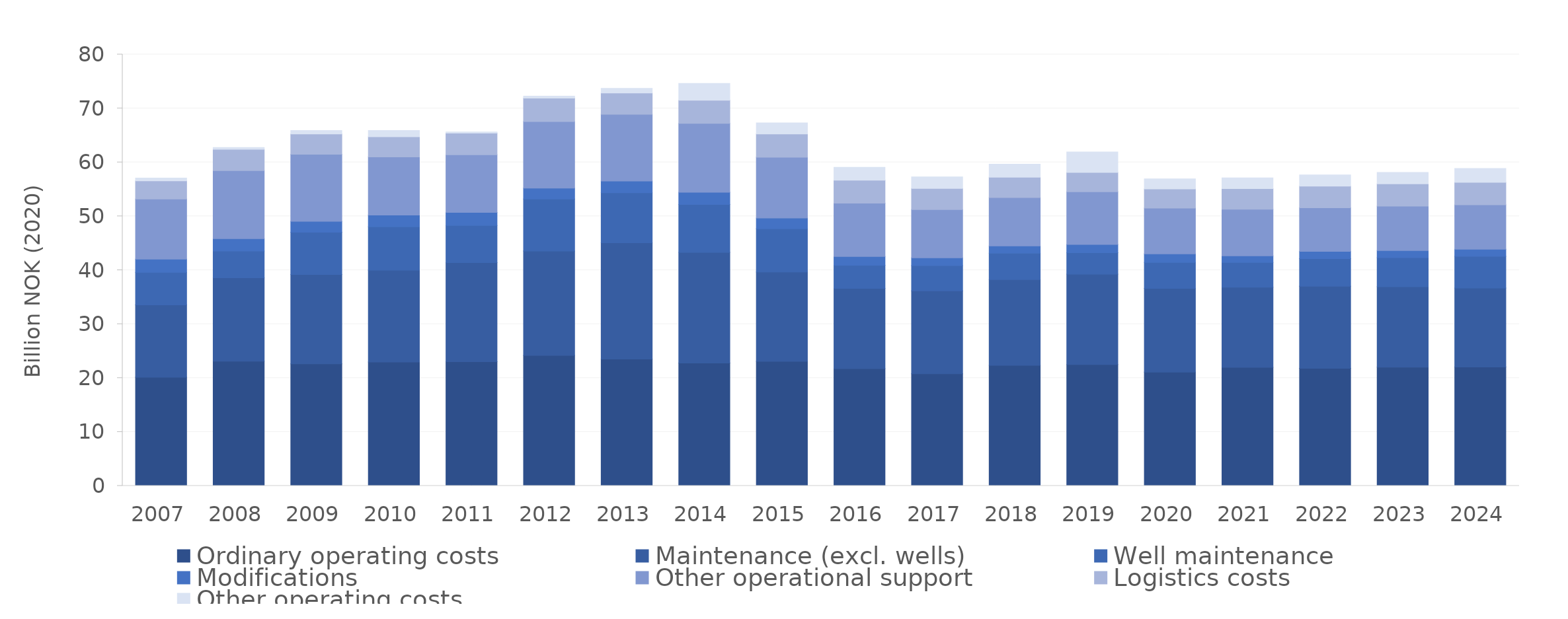
| Category | Ordinary operating costs | Maintenance (excl. wells) | Well maintenance | Modifications  | Other operational support  | Logistics costs | Other operating costs |
|---|---|---|---|---|---|---|---|
| 2007.0 | 20.142 | 13.429 | 6.018 | 2.45 | 11.175 | 3.368 | 0.497 |
| 2008.0 | 23.115 | 15.475 | 4.974 | 2.282 | 12.621 | 3.939 | 0.335 |
| 2009.0 | 22.637 | 16.575 | 7.828 | 2.014 | 12.439 | 3.78 | 0.625 |
| 2010.0 | 22.98 | 17.029 | 8.037 | 2.17 | 10.803 | 3.735 | 1.153 |
| 2011.0 | 23.017 | 18.397 | 6.879 | 2.429 | 10.675 | 4.035 | 0.202 |
| 2012.0 | 24.188 | 19.376 | 9.651 | 2.011 | 12.341 | 4.336 | 0.392 |
| 2013.0 | 23.53 | 21.565 | 9.262 | 2.176 | 12.387 | 3.954 | 0.84 |
| 2014.0 | 22.778 | 20.543 | 8.865 | 2.275 | 12.774 | 4.285 | 3.129 |
| 2015.0 | 23.107 | 16.565 | 8.002 | 1.994 | 11.271 | 4.337 | 2.031 |
| 2016.0 | 21.757 | 14.869 | 4.302 | 1.612 | 9.894 | 4.261 | 2.388 |
| 2017.0 | 20.802 | 15.381 | 4.667 | 1.447 | 8.95 | 3.92 | 2.151 |
| 2018.0 | 22.361 | 15.907 | 4.899 | 1.344 | 8.979 | 3.76 | 2.426 |
| 2019.0 | 22.505 | 16.775 | 3.952 | 1.532 | 9.785 | 3.591 | 3.796 |
| 2020.0 | 21.101 | 15.525 | 4.818 | 1.596 | 8.467 | 3.576 | 1.838 |
| 2021.0 | 21.998 | 14.854 | 4.582 | 1.239 | 8.642 | 3.813 | 1.984 |
| 2022.0 | 21.815 | 15.204 | 5.133 | 1.348 | 8.084 | 4.003 | 2.09 |
| 2023.0 | 22.023 | 14.901 | 5.41 | 1.324 | 8.225 | 4.143 | 2.096 |
| 2024.0 | 22.059 | 14.621 | 5.879 | 1.33 | 8.229 | 4.173 | 2.574 |